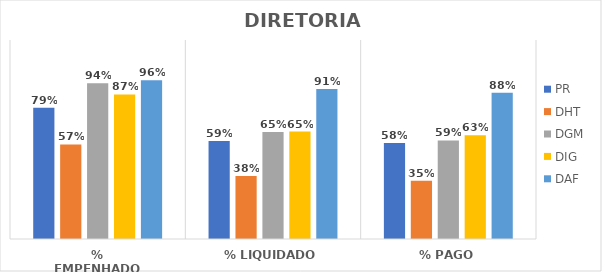
| Category | PR | DHT | DGM | DIG | DAF |
|---|---|---|---|---|---|
| % EMPENHADO | 0.791 | 0.57 | 0.939 | 0.872 | 0.958 |
| % LIQUIDADO | 0.591 | 0.38 | 0.646 | 0.648 | 0.905 |
| % PAGO | 0.579 | 0.352 | 0.595 | 0.626 | 0.882 |